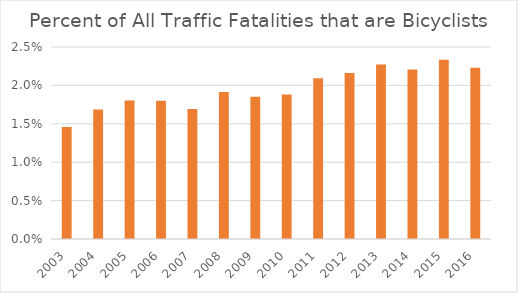
| Category | Series 1 |
|---|---|
| 2003.0 | 0.015 |
| 2004.0 | 0.017 |
| 2005.0 | 0.018 |
| 2006.0 | 0.018 |
| 2007.0 | 0.017 |
| 2008.0 | 0.019 |
| 2009.0 | 0.019 |
| 2010.0 | 0.019 |
| 2011.0 | 0.021 |
| 2012.0 | 0.022 |
| 2013.0 | 0.023 |
| 2014.0 | 0.022 |
| 2015.0 | 0.023 |
| 2016.0 | 0.022 |